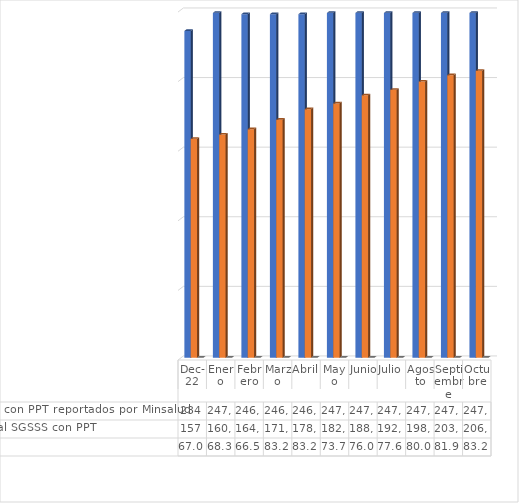
| Category | Nro de Migrantes con PPT reportados por Minsalud  | Nro de Afiliados al SGSSS con PPT | % Cobertura |
|---|---|---|---|
| dic-22 | 234864 | 157372 | 67.006 |
| Enero | 247821 | 160416 | 68.302 |
| Febrero | 246878 | 164261 | 66.535 |
| Marzo | 246878 | 171077 | 83.206 |
| Abril | 246878 | 178625 | 83.206 |
| Mayo | 247821 | 182754 | 73.744 |
| Junio | 247821 | 188578 | 76.094 |
| Julio | 247821 | 192533 | 77.69 |
| Agosto | 247821 | 198485 | 80.092 |
| Septiembre | 247821 | 203073 | 81.943 |
| Octubre | 247821 | 206201 | 83.206 |